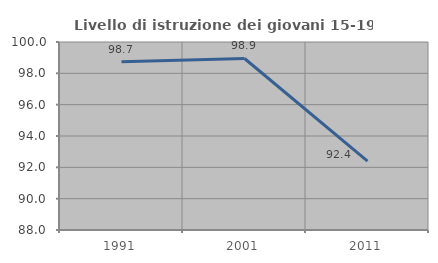
| Category | Livello di istruzione dei giovani 15-19 anni |
|---|---|
| 1991.0 | 98.734 |
| 2001.0 | 98.947 |
| 2011.0 | 92.391 |